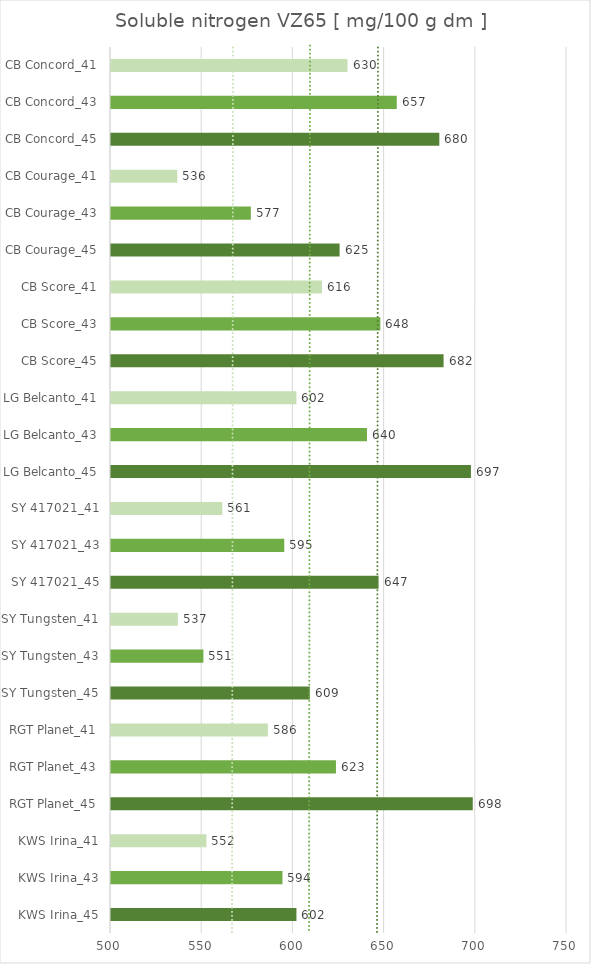
| Category |   Soluble nitrogen VZ65 [ mg/100 g dm ] |
|---|---|
| KWS Irina_45 | 601.667 |
| KWS Irina_43 | 594 |
| KWS Irina_41 | 552.333 |
| RGT Planet_45 | 698.333 |
| RGT Planet_43 | 623.333 |
| RGT Planet_41 | 586 |
| SY Tungsten_45 | 609 |
| SY Tungsten_43 | 550.667 |
| SY Tungsten_41 | 536.667 |
| SY 417021_45 | 646.667 |
| SY 417021_43 | 595 |
| SY 417021_41 | 561 |
| LG Belcanto_45 | 697.333 |
| LG Belcanto_43 | 640.333 |
| LG Belcanto_41 | 601.667 |
| CB Score_45 | 682.333 |
| CB Score_43 | 647.667 |
| CB Score_41 | 615.667 |
| CB Courage_45 | 625.333 |
| CB Courage_43 | 576.667 |
| CB Courage_41 | 536.333 |
| CB Concord_45 | 680 |
| CB Concord_43 | 656.667 |
| CB Concord_41 | 629.667 |